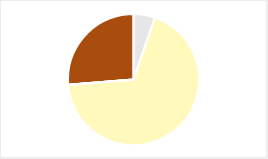
| Category | Series 0 |
|---|---|
| 0 | 0.053 |
| 1 | 0.684 |
| 2 | 0 |
| 3 | 0 |
| 4 | 0.263 |